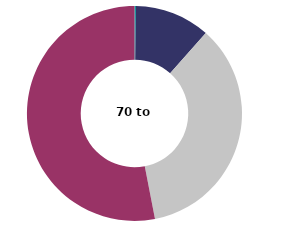
| Category | 70 to 89m² |
|---|---|
| 1 or 2 | 0.219 |
| 3 | 11.322 |
| 4 | 35.404 |
| 5 or more | 53.055 |